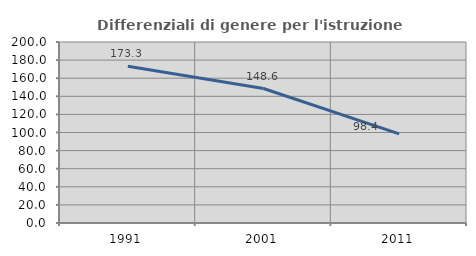
| Category | Differenziali di genere per l'istruzione superiore |
|---|---|
| 1991.0 | 173.314 |
| 2001.0 | 148.585 |
| 2011.0 | 98.426 |